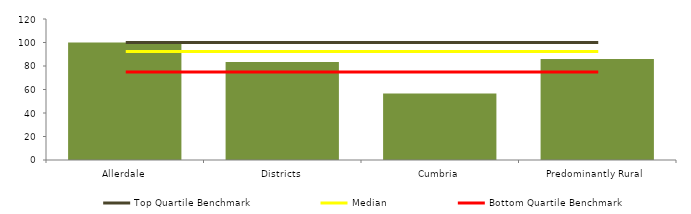
| Category | Block Data |
|---|---|
| Allerdale | 100 |
| Districts | 83.488 |
| Cumbria | 56.667 |
|  Predominantly Rural   | 85.899 |